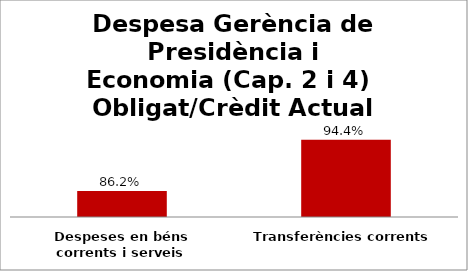
| Category | Series 0 |
|---|---|
| Despeses en béns corrents i serveis | 0.862 |
| Transferències corrents | 0.944 |